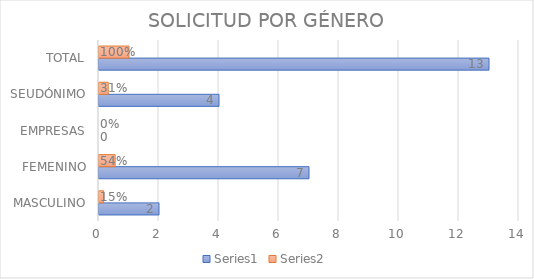
| Category | Series 0 | Series 1 |
|---|---|---|
| MASCULINO | 2 | 0.154 |
| FEMENINO | 7 | 0.538 |
| EMPRESAS | 0 | 0 |
| SEUDÓNIMO | 4 | 0.308 |
| TOTAL | 13 | 1 |